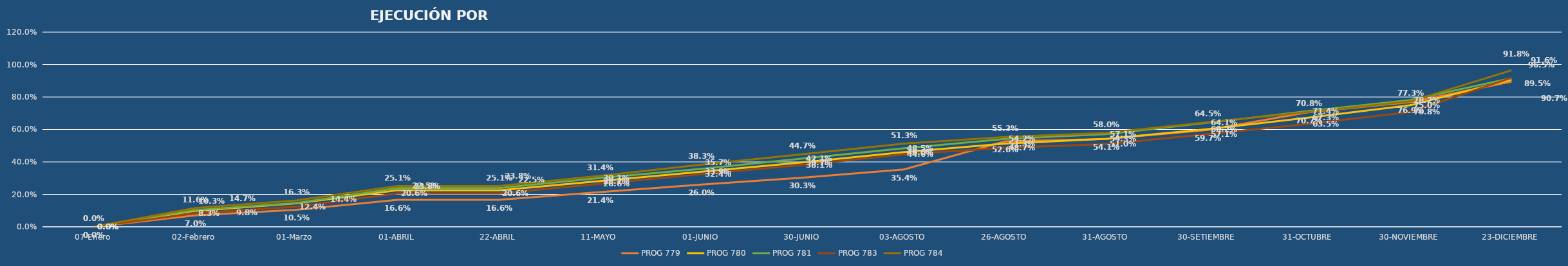
| Category | PROG 779 | PROG 780 | PROG 781 | PROG 783 | PROG 784 |
|---|---|---|---|---|---|
| 07-Enero | 0 | 0 | 0 | 0 | 0 |
| 02-Febrero | 0.07 | 0.098 | 0.103 | 0.083 | 0.116 |
| 01-Marzo | 0.105 | 0.144 | 0.147 | 0.124 | 0.163 |
| 01-ABRIL | 0.166 | 0.225 | 0.238 | 0.206 | 0.251 |
| 22-ABRIL | 0.166 | 0.225 | 0.238 | 0.206 | 0.251 |
| 11-MAYO | 0.214 | 0.282 | 0.301 | 0.266 | 0.314 |
| 01-JUNIO | 0.26 | 0.339 | 0.357 | 0.324 | 0.383 |
| 30-JUNIO | 0.303 | 0.397 | 0.421 | 0.381 | 0.447 |
| 03-AGOSTO | 0.354 | 0.46 | 0.485 | 0.446 | 0.513 |
| 26-AGOSTO | 0.526 | 0.513 | 0.542 | 0.487 | 0.553 |
| 31-AGOSTO | 0.541 | 0.543 | 0.571 | 0.51 | 0.58 |
| 30-SETIEMBRE | 0.597 | 0.602 | 0.641 | 0.571 | 0.645 |
| 31-OCTUBRE | 0.707 | 0.673 | 0.714 | 0.635 | 0.708 |
| 30-NOVIEMBRE | 0.769 | 0.75 | 0.782 | 0.708 | 0.773 |
| 23-DICIEMBRE | 0.895 | 0.907 | 0.916 | 0.918 | 0.965 |